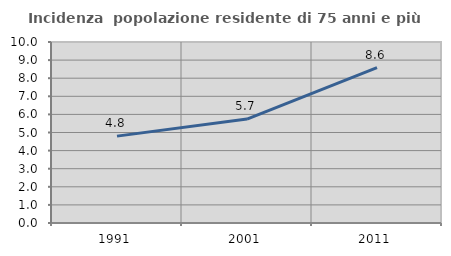
| Category | Incidenza  popolazione residente di 75 anni e più |
|---|---|
| 1991.0 | 4.8 |
| 2001.0 | 5.745 |
| 2011.0 | 8.586 |